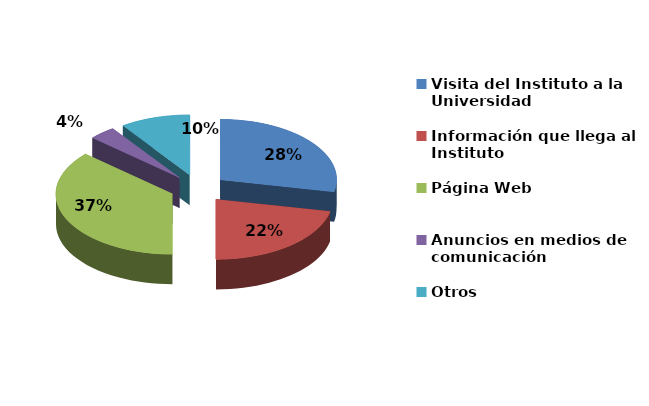
| Category | Series 0 |
|---|---|
| Visita del Instituto a la Universidad | 61 |
| Información que llega al Instituto | 47 |
| Página Web | 79 |
| Anuncios en medios de comunicación | 8 |
| Otros | 21 |